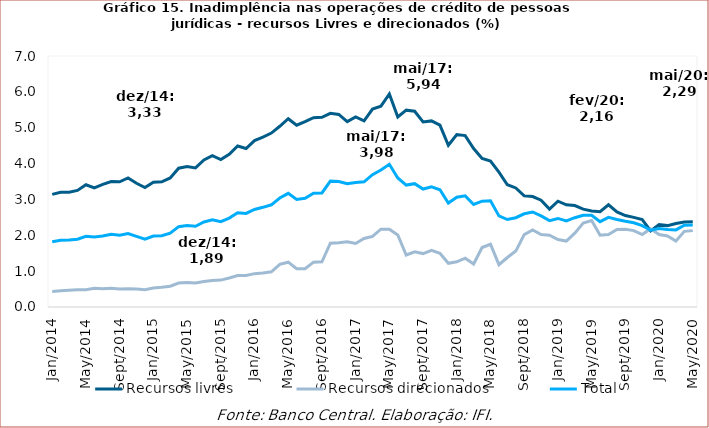
| Category | Recursos livres | Recursos direcionados | Total |
|---|---|---|---|
| 2014-01-01 | 3.14 | 0.43 | 1.82 |
| 2014-02-01 | 3.2 | 0.45 | 1.86 |
| 2014-03-01 | 3.2 | 0.47 | 1.87 |
| 2014-04-01 | 3.25 | 0.48 | 1.89 |
| 2014-05-01 | 3.41 | 0.48 | 1.97 |
| 2014-06-01 | 3.32 | 0.52 | 1.95 |
| 2014-07-01 | 3.42 | 0.51 | 1.98 |
| 2014-08-01 | 3.5 | 0.52 | 2.03 |
| 2014-09-01 | 3.49 | 0.5 | 2 |
| 2014-10-01 | 3.6 | 0.51 | 2.05 |
| 2014-11-01 | 3.45 | 0.5 | 1.97 |
| 2014-12-01 | 3.33 | 0.48 | 1.89 |
| 2015-01-01 | 3.48 | 0.53 | 1.98 |
| 2015-02-01 | 3.49 | 0.55 | 1.99 |
| 2015-03-01 | 3.6 | 0.58 | 2.06 |
| 2015-04-01 | 3.87 | 0.67 | 2.24 |
| 2015-05-01 | 3.92 | 0.68 | 2.27 |
| 2015-06-01 | 3.88 | 0.67 | 2.25 |
| 2015-07-01 | 4.1 | 0.71 | 2.37 |
| 2015-08-01 | 4.22 | 0.74 | 2.43 |
| 2015-09-01 | 4.11 | 0.75 | 2.38 |
| 2015-10-01 | 4.26 | 0.81 | 2.48 |
| 2015-11-01 | 4.49 | 0.88 | 2.63 |
| 2015-12-01 | 4.42 | 0.88 | 2.61 |
| 2016-01-01 | 4.64 | 0.93 | 2.72 |
| 2016-02-01 | 4.74 | 0.95 | 2.78 |
| 2016-03-01 | 4.85 | 0.98 | 2.85 |
| 2016-04-01 | 5.04 | 1.19 | 3.04 |
| 2016-05-01 | 5.25 | 1.25 | 3.17 |
| 2016-06-01 | 5.07 | 1.07 | 3 |
| 2016-07-01 | 5.17 | 1.07 | 3.03 |
| 2016-08-01 | 5.28 | 1.25 | 3.17 |
| 2016-09-01 | 5.29 | 1.26 | 3.18 |
| 2016-10-01 | 5.4 | 1.78 | 3.51 |
| 2016-11-01 | 5.37 | 1.79 | 3.5 |
| 2016-12-01 | 5.17 | 1.82 | 3.44 |
| 2017-01-01 | 5.3 | 1.77 | 3.47 |
| 2017-02-01 | 5.19 | 1.91 | 3.49 |
| 2017-03-01 | 5.52 | 1.97 | 3.69 |
| 2017-04-01 | 5.6 | 2.17 | 3.82 |
| 2017-05-01 | 5.94 | 2.17 | 3.98 |
| 2017-06-01 | 5.3 | 2.01 | 3.6 |
| 2017-07-01 | 5.49 | 1.45 | 3.4 |
| 2017-08-01 | 5.46 | 1.54 | 3.44 |
| 2017-09-01 | 5.16 | 1.49 | 3.29 |
| 2017-10-01 | 5.19 | 1.58 | 3.35 |
| 2017-11-01 | 5.07 | 1.5 | 3.27 |
| 2017-12-01 | 4.51 | 1.22 | 2.9 |
| 2018-01-01 | 4.81 | 1.26 | 3.06 |
| 2018-02-01 | 4.78 | 1.36 | 3.1 |
| 2018-03-01 | 4.42 | 1.2 | 2.86 |
| 2018-04-01 | 4.14 | 1.66 | 2.95 |
| 2018-05-01 | 4.07 | 1.75 | 2.96 |
| 2018-06-01 | 3.76 | 1.18 | 2.54 |
| 2018-07-01 | 3.41 | 1.38 | 2.44 |
| 2018-08-01 | 3.32 | 1.56 | 2.49 |
| 2018-09-01 | 3.1 | 2.02 | 2.6 |
| 2018-10-01 | 3.08 | 2.15 | 2.65 |
| 2018-11-01 | 2.98 | 2.02 | 2.54 |
| 2018-12-01 | 2.73 | 2 | 2.41 |
| 2019-01-01 | 2.95 | 1.88 | 2.47 |
| 2019-02-01 | 2.85 | 1.84 | 2.4 |
| 2019-03-01 | 2.83 | 2.06 | 2.49 |
| 2019-04-01 | 2.73 | 2.34 | 2.56 |
| 2019-05-01 | 2.68 | 2.41 | 2.56 |
| 2019-06-01 | 2.66 | 2 | 2.38 |
| 2019-07-01 | 2.85 | 2.02 | 2.5 |
| 2019-08-01 | 2.65 | 2.16 | 2.44 |
| 2019-09-01 | 2.55 | 2.17 | 2.39 |
| 2019-10-01 | 2.5 | 2.13 | 2.35 |
| 2019-11-01 | 2.44 | 2.02 | 2.27 |
| 2019-12-01 | 2.12 | 2.18 | 2.14 |
| 2020-01-01 | 2.3 | 2.02 | 2.19 |
| 2020-02-01 | 2.27 | 1.98 | 2.16 |
| 2020-03-01 | 2.33 | 1.84 | 2.15 |
| 2020-04-01 | 2.37 | 2.11 | 2.28 |
| 2020-05-01 | 2.38 | 2.13 | 2.29 |